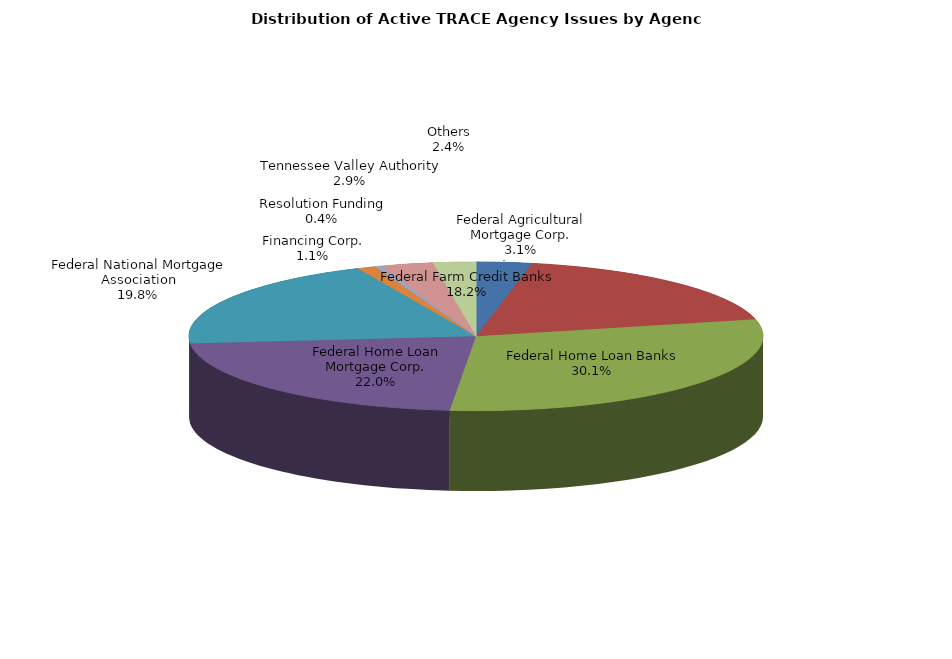
| Category | Series 0 |
|---|---|
| Federal Agricultural Mortgage Corp. | 573 |
| Federal Farm Credit Banks | 3328 |
| Federal Home Loan Banks | 5516 |
| Federal Home Loan Mortgage Corp. | 4026 |
| Federal National Mortgage Association | 3620 |
| Financing Corp. | 194 |
| Resolution Funding | 66 |
| Tennessee Valley Authority | 537 |
| Others | 440 |